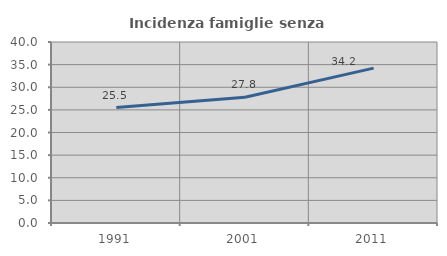
| Category | Incidenza famiglie senza nuclei |
|---|---|
| 1991.0 | 25.521 |
| 2001.0 | 27.809 |
| 2011.0 | 34.219 |